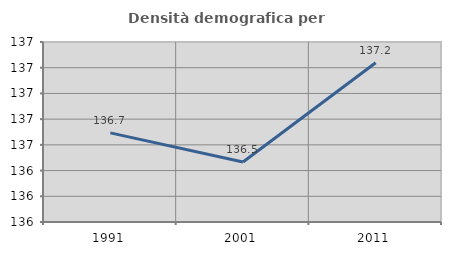
| Category | Densità demografica |
|---|---|
| 1991.0 | 136.693 |
| 2001.0 | 136.466 |
| 2011.0 | 137.238 |